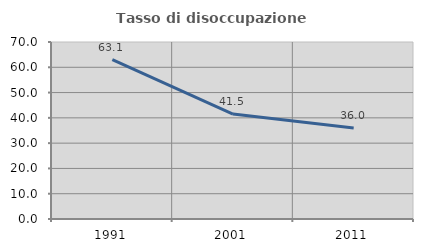
| Category | Tasso di disoccupazione giovanile  |
|---|---|
| 1991.0 | 63.063 |
| 2001.0 | 41.509 |
| 2011.0 | 36 |